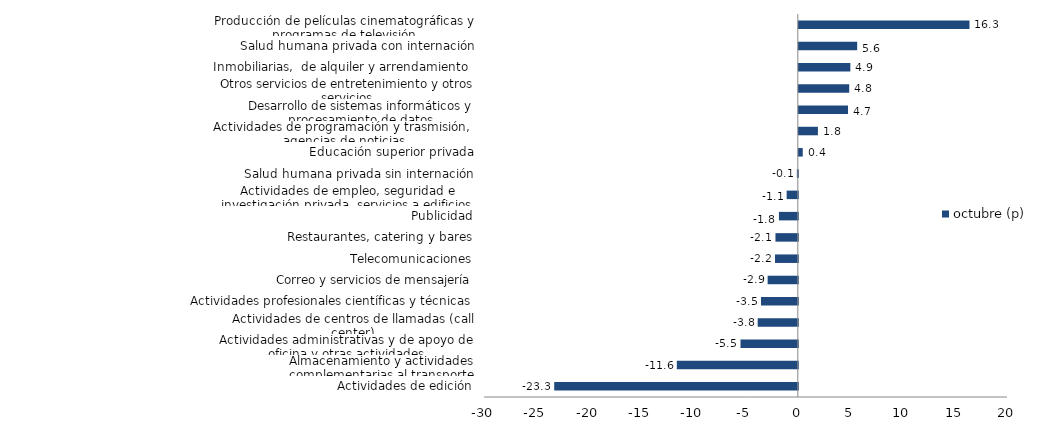
| Category | octubre (p) |
|---|---|
| Actividades de edición | -23.288 |
| Almacenamiento y actividades complementarias al transporte | -11.566 |
| Actividades administrativas y de apoyo de oficina y otras actividades | -5.479 |
| Actividades de centros de llamadas (call center) | -3.834 |
| Actividades profesionales científicas y técnicas  | -3.519 |
| Correo y servicios de mensajería | -2.884 |
| Telecomunicaciones | -2.179 |
| Restaurantes, catering y bares | -2.137 |
| Publicidad | -1.805 |
| Actividades de empleo, seguridad e investigación privada, servicios a edificios | -1.066 |
| Salud humana privada sin internación | -0.091 |
| Educación superior privada | 0.376 |
| Actividades de programación y trasmisión,  agencias de noticias | 1.829 |
| Desarrollo de sistemas informáticos y procesamiento de datos | 4.705 |
| Otros servicios de entretenimiento y otros servicios | 4.82 |
| Inmobiliarias,  de alquiler y arrendamiento  | 4.93 |
| Salud humana privada con internación | 5.581 |
| Producción de películas cinematográficas y programas de televisión | 16.319 |